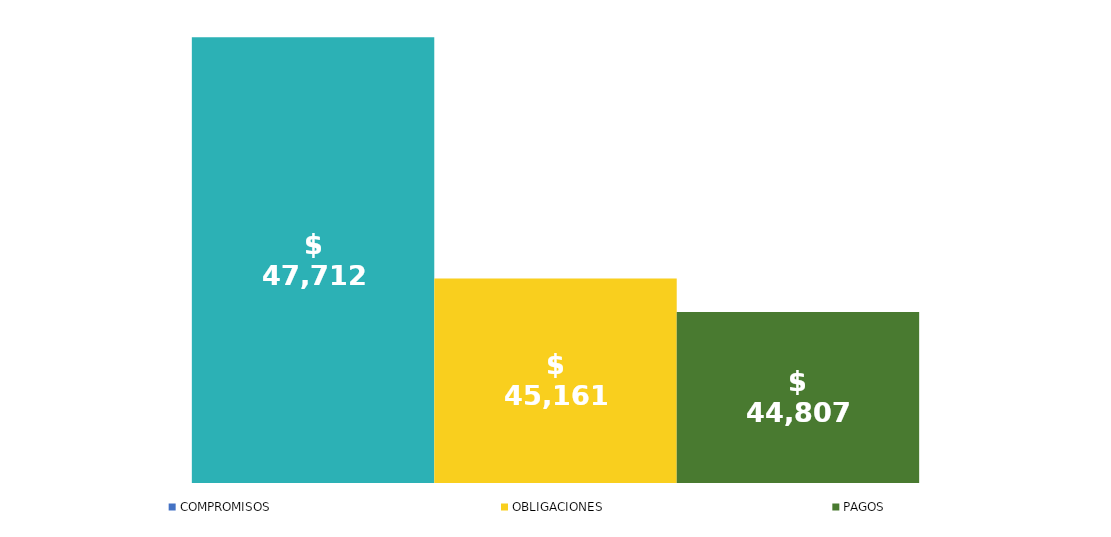
| Category | COMPROMISOS | OBLIGACIONES | PAGOS |
|---|---|---|---|
| Total | 47712415624.843 | 45161428238.843 | 44807359563.843 |